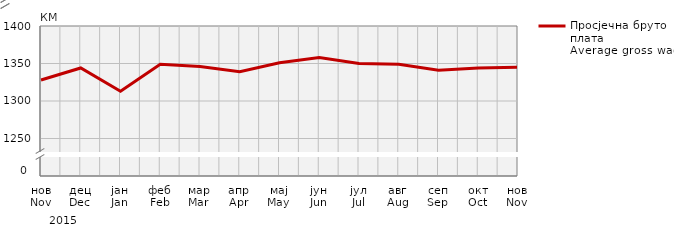
| Category | Просјечна бруто плата
Average gross wage |
|---|---|
| нов
Nov | 1328 |
| дец
Dec | 1344 |
| јан
Jan | 1313 |
| феб
Feb | 1349 |
| мар
Mar | 1346 |
| апр
Apr | 1339 |
| мај
May | 1351 |
| јун
Jun | 1358 |
| јул
Jul | 1350 |
| авг
Aug | 1349 |
| сеп
Sep | 1341 |
| окт
Oct | 1344 |
| нов
Nov | 1345 |